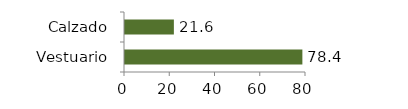
| Category | Vestuario y calzado |
|---|---|
| Vestuario | 78.398 |
| Calzado | 21.602 |